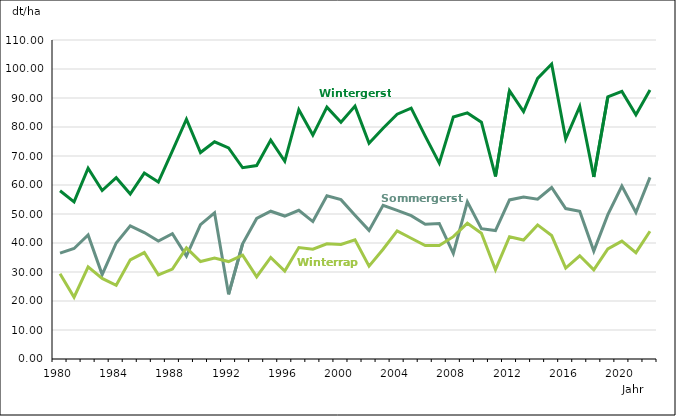
| Category | Wintergerste | Sommergerste | Winterraps |
|---|---|---|---|
| 1980.0 | 58 | 36.5 | 29.4 |
| 1981.0 | 54.2 | 38.1 | 21.3 |
| 1982.0 | 65.8 | 42.8 | 31.8 |
| 1983.0 | 58.1 | 29.1 | 27.8 |
| 1984.0 | 62.5 | 40 | 25.4 |
| 1985.0 | 56.9 | 45.9 | 34.2 |
| 1986.0 | 64.1 | 43.6 | 36.7 |
| 1987.0 | 61 | 40.7 | 29 |
| 1988.0 | 71.8 | 43.2 | 31 |
| 1989.0 | 82.7 | 35.5 | 38.3 |
| 1990.0 | 71.2 | 46.3 | 33.6 |
| 1991.0 | 74.9 | 50.4 | 34.8 |
| 1992.0 | 72.8 | 22.3 | 33.6 |
| 1993.0 | 65.95 | 39.75 | 35.8 |
| 1994.0 | 66.69 | 48.47 | 28.36 |
| 1995.0 | 75.47 | 50.96 | 35.03 |
| 1996.0 | 68.18 | 49.3 | 30.33 |
| 1997.0 | 85.97 | 51.27 | 38.44 |
| 1998.0 | 77.22 | 47.39 | 37.87 |
| 1999.0 | 86.85 | 56.28 | 39.7 |
| 2000.0 | 81.67 | 54.94 | 39.48 |
| 2001.0 | 87.2 | 49.6 | 41.11 |
| 2002.0 | 74.39 | 44.35 | 32.03 |
| 2003.0 | 79.59 | 53.01 | 37.85 |
| 2004.0 | 84.4 | 51.26 | 44.17 |
| 2005.0 | 86.52 | 49.41 | 41.65 |
| 2006.0 | 76.84 | 46.44 | 39.13 |
| 2007.0 | 67.54 | 46.74 | 39.1 |
| 2008.0 | 83.42 | 36.38 | 42.19 |
| 2009.0 | 84.86 | 54.2 | 46.83 |
| 2010.0 | 81.68 | 44.96 | 43.38 |
| 2011.0 | 62.94 | 44.3 | 30.79 |
| 2012.0 | 92.53 | 54.86 | 42.17 |
| 2013.0 | 85.3 | 55.86 | 41.04 |
| 2014.0 | 96.75 | 55.13 | 46.24 |
| 2015.0 | 101.72 | 59.13 | 42.56 |
| 2016.0 | 75.88 | 51.87 | 31.36 |
| 2017.0 | 87.06 | 50.91 | 35.6 |
| 2018.0 | 62.79 | 37.22 | 30.76 |
| 2019.0 | 90.38 | 49.78 | 37.97 |
| 2020.0 | 92.27 | 59.64 | 40.64 |
| 2021.0 | 84.21 | 50.53 | 36.66 |
| 2022.0 | 92.74 | 62.63 | 44.06 |